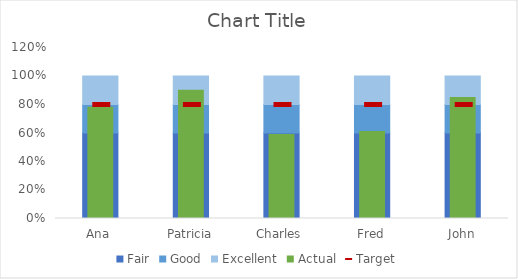
| Category | Fair | Good | Excellent |
|---|---|---|---|
| Ana | 0.6 | 0.2 | 0.2 |
| Patricia | 0.6 | 0.2 | 0.2 |
| Charles | 0.6 | 0.2 | 0.2 |
| Fred | 0.6 | 0.2 | 0.2 |
| John | 0.6 | 0.2 | 0.2 |